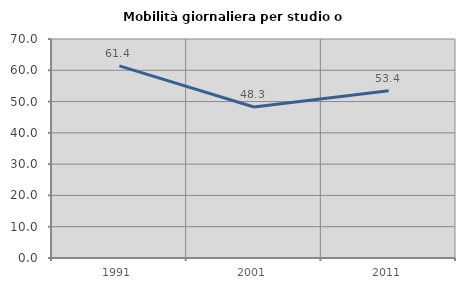
| Category | Mobilità giornaliera per studio o lavoro |
|---|---|
| 1991.0 | 61.404 |
| 2001.0 | 48.276 |
| 2011.0 | 53.448 |